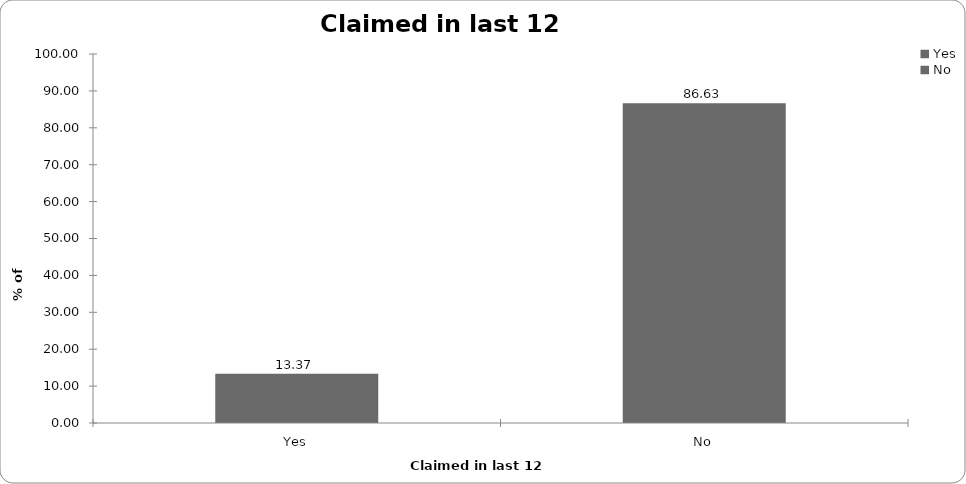
| Category | Claimed in last 12 months |
|---|---|
| Yes | 13.373 |
| No | 86.627 |